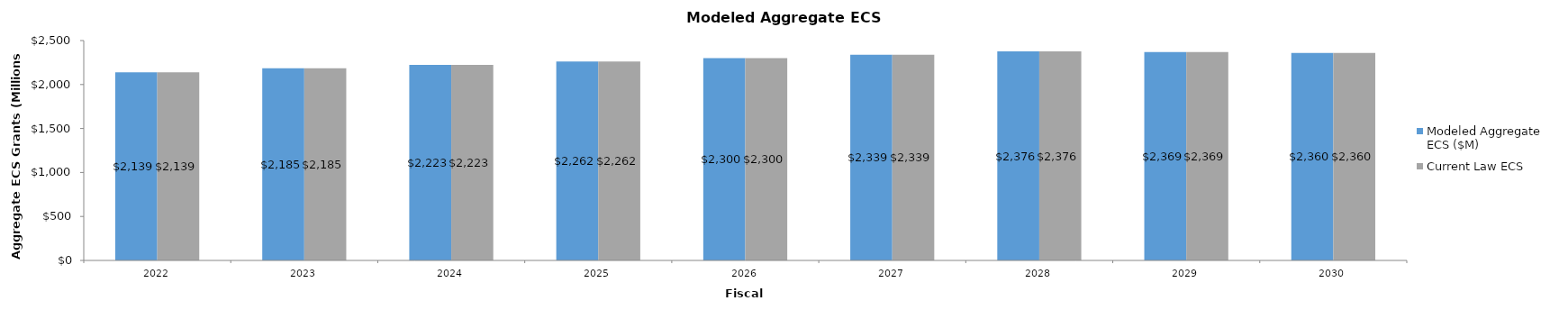
| Category | Modeled Aggregate
ECS ($M) | Current Law ECS |
|---|---|---|
| 2022.0 | 2139 | 2139 |
| 2023.0 | 2185 | 2185 |
| 2024.0 | 2223 | 2223 |
| 2025.0 | 2262 | 2262 |
| 2026.0 | 2300 | 2300 |
| 2027.0 | 2339 | 2339 |
| 2028.0 | 2376 | 2376 |
| 2029.0 | 2369 | 2369 |
| 2030.0 | 2360 | 2360 |